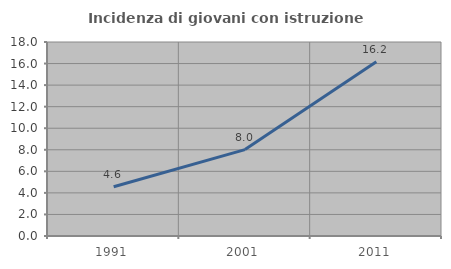
| Category | Incidenza di giovani con istruzione universitaria |
|---|---|
| 1991.0 | 4.564 |
| 2001.0 | 8.017 |
| 2011.0 | 16.168 |